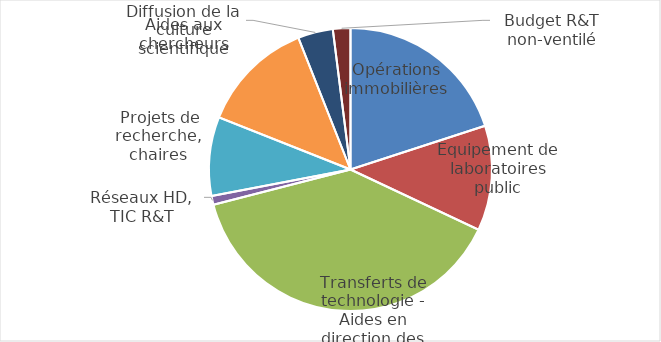
| Category | 20% |
|---|---|
| Opérations immobilières | 0.2 |
| Equipement de laboratoires public | 0.12 |
| Transferts de technologie - Aides en direction des entreprises innovantes | 0.39 |
| Réseaux HD, TIC R&T | 0.01 |
|  Projets de recherche, chaires | 0.09 |
| Aides aux chercheurs | 0.13 |
| Diffusion de la culture scientifique | 0.04 |
| Budget R&T non-ventilé | 0.02 |